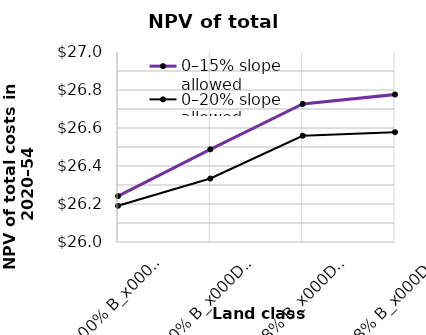
| Category | 0–15% slope allowed | 0–20% slope allowed |
|---|---|---|
| 100% B_x000d_100% C | 26241353377.079 | 26190510910.506 |
| 10% B_x000d_10% C | 26487682062.345 | 26334062791.4 |
| 1.8% B_x000d_1.1% C | 26726482435.446 | 26559329495.778 |
| 1.8% B_x000d_1.1% C_x000d_no new wind | 26776185874.533 | 26577871176.596 |